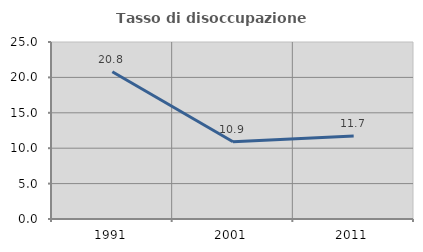
| Category | Tasso di disoccupazione giovanile  |
|---|---|
| 1991.0 | 20.805 |
| 2001.0 | 10.909 |
| 2011.0 | 11.712 |